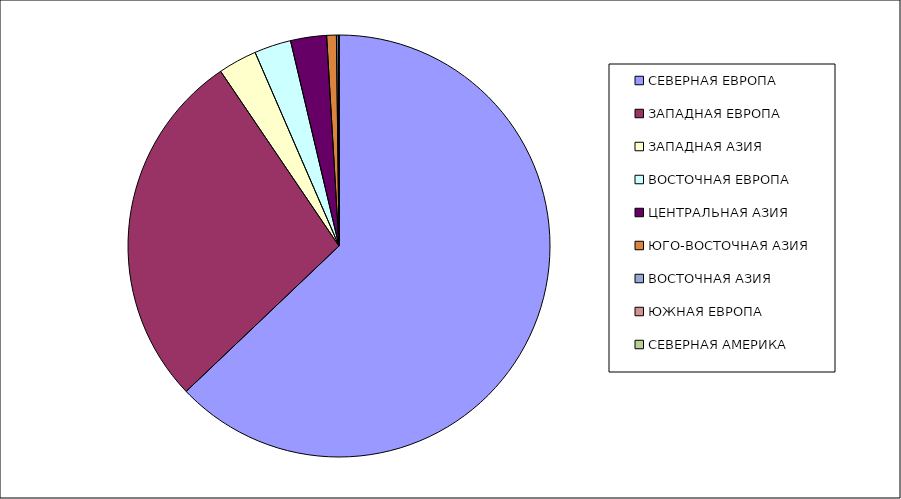
| Category | Оборот |
|---|---|
| СЕВЕРНАЯ ЕВРОПА | 62.894 |
| ЗАПАДНАЯ ЕВРОПА | 27.627 |
| ЗАПАДНАЯ АЗИЯ | 2.969 |
| ВОСТОЧНАЯ ЕВРОПА | 2.817 |
| ЦЕНТРАЛЬНАЯ АЗИЯ | 2.755 |
| ЮГО-ВОСТОЧНАЯ АЗИЯ | 0.743 |
| ВОСТОЧНАЯ АЗИЯ | 0.142 |
| ЮЖНАЯ ЕВРОПА | 0.05 |
| СЕВЕРНАЯ АМЕРИКА | 0.002 |